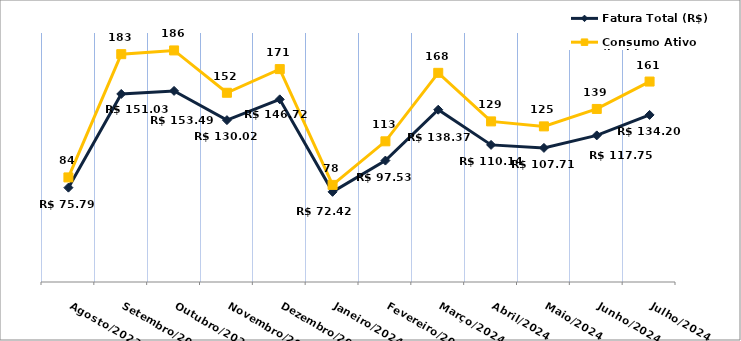
| Category | Fatura Total (R$) | Consumo Ativo (kWh) |
|---|---|---|
| Agosto/2023 | 75.79 | 84 |
| Setembro/2023 | 151.03 | 183 |
| Outubro/2023 | 153.49 | 186 |
| Novembro/2023 | 130.02 | 152 |
| Dezembro/2023 | 146.72 | 171 |
| Janeiro/2024 | 72.42 | 78 |
| Fevereiro/2024 | 97.53 | 113 |
| Março/2024 | 138.37 | 168 |
| Abril/2024 | 110.14 | 129 |
| Maio/2024 | 107.71 | 125 |
| Junho/2024 | 117.75 | 139 |
| Julho/2024 | 134.2 | 161 |